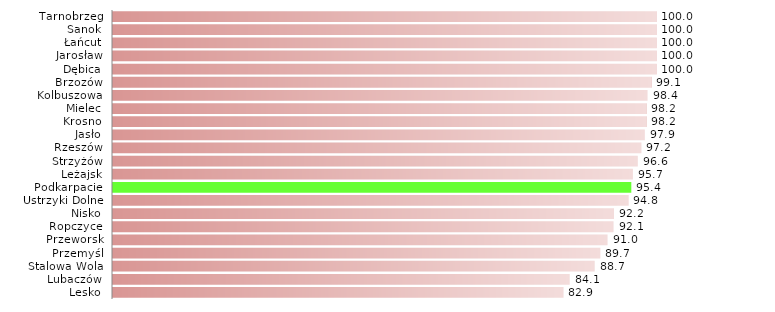
| Category | a |
|---|---|
| Lesko | 82.857 |
| Lubaczów | 84.058 |
| Stalowa Wola | 88.66 |
| Przemyśl | 89.655 |
| Przeworsk | 91.026 |
| Ropczyce | 92.126 |
| Nisko | 92.208 |
| Ustrzyki Dolne | 94.828 |
| Podkarpacie | 95.396 |
| Leżajsk | 95.69 |
| Strzyżów | 96.591 |
| Rzeszów | 97.207 |
| Jasło | 97.884 |
| Krosno | 98.165 |
| Mielec | 98.165 |
| Kolbuszowa | 98.387 |
| Brzozów | 99.091 |
| Dębica | 100 |
| Jarosław | 100 |
| Łańcut | 100 |
| Sanok | 100 |
| Tarnobrzeg | 100 |